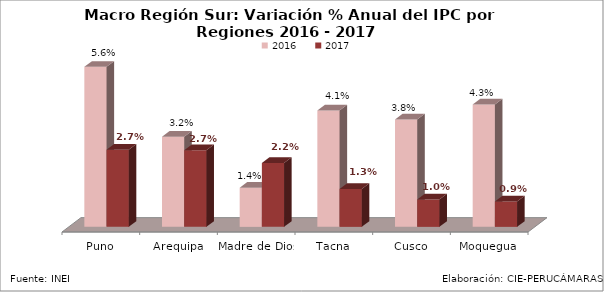
| Category | 2016 | 2017 |
|---|---|---|
| Puno | 0.056 | 0.027 |
| Arequipa | 0.032 | 0.027 |
| Madre de Dios | 0.014 | 0.022 |
| Tacna | 0.041 | 0.013 |
| Cusco | 0.038 | 0.01 |
| Moquegua | 0.043 | 0.009 |